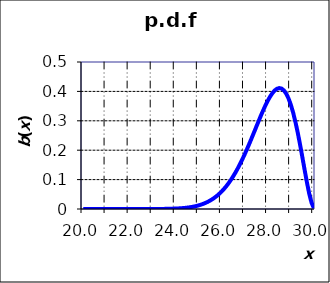
| Category | b(x) |
|---|---|
| 20.0 | 0 |
| 20.1 | 0 |
| 20.200000000000003 | 0 |
| 20.300000000000004 | 0 |
| 20.400000000000006 | 0 |
| 20.500000000000007 | 0 |
| 20.60000000000001 | 0 |
| 20.70000000000001 | 0 |
| 20.80000000000001 | 0 |
| 20.900000000000013 | 0 |
| 21.000000000000014 | 0 |
| 21.100000000000016 | 0 |
| 21.200000000000017 | 0 |
| 21.30000000000002 | 0 |
| 21.40000000000002 | 0 |
| 21.50000000000002 | 0 |
| 21.600000000000023 | 0 |
| 21.700000000000024 | 0 |
| 21.800000000000026 | 0 |
| 21.900000000000027 | 0 |
| 22.00000000000003 | 0 |
| 22.10000000000003 | 0 |
| 22.20000000000003 | 0 |
| 22.300000000000033 | 0 |
| 22.400000000000034 | 0 |
| 22.500000000000036 | 0 |
| 22.600000000000037 | 0 |
| 22.70000000000004 | 0 |
| 22.80000000000004 | 0 |
| 22.90000000000004 | 0 |
| 23.000000000000043 | 0 |
| 23.100000000000044 | 0 |
| 23.200000000000045 | 0 |
| 23.300000000000047 | 0 |
| 23.40000000000005 | 0 |
| 23.50000000000005 | 0 |
| 23.60000000000005 | 0.001 |
| 23.700000000000053 | 0.001 |
| 23.800000000000054 | 0.001 |
| 23.900000000000055 | 0.001 |
| 24.000000000000057 | 0.001 |
| 24.10000000000006 | 0.002 |
| 24.20000000000006 | 0.002 |
| 24.30000000000006 | 0.003 |
| 24.400000000000063 | 0.004 |
| 24.500000000000064 | 0.005 |
| 24.600000000000065 | 0.006 |
| 24.700000000000067 | 0.007 |
| 24.800000000000068 | 0.008 |
| 24.90000000000007 | 0.01 |
| 25.00000000000007 | 0.012 |
| 25.100000000000072 | 0.015 |
| 25.200000000000074 | 0.017 |
| 25.300000000000075 | 0.021 |
| 25.400000000000077 | 0.024 |
| 25.500000000000078 | 0.029 |
| 25.60000000000008 | 0.033 |
| 25.70000000000008 | 0.039 |
| 25.800000000000082 | 0.045 |
| 25.900000000000084 | 0.052 |
| 26.000000000000085 | 0.059 |
| 26.100000000000087 | 0.068 |
| 26.200000000000088 | 0.077 |
| 26.30000000000009 | 0.087 |
| 26.40000000000009 | 0.099 |
| 26.500000000000092 | 0.111 |
| 26.600000000000094 | 0.124 |
| 26.700000000000095 | 0.138 |
| 26.800000000000097 | 0.153 |
| 26.900000000000098 | 0.169 |
| 27.0000000000001 | 0.186 |
| 27.1000000000001 | 0.203 |
| 27.200000000000102 | 0.221 |
| 27.300000000000104 | 0.24 |
| 27.400000000000105 | 0.259 |
| 27.500000000000107 | 0.279 |
| 27.600000000000108 | 0.298 |
| 27.70000000000011 | 0.317 |
| 27.80000000000011 | 0.335 |
| 27.900000000000112 | 0.352 |
| 28.000000000000114 | 0.368 |
| 28.100000000000115 | 0.382 |
| 28.200000000000117 | 0.394 |
| 28.300000000000118 | 0.403 |
| 28.40000000000012 | 0.409 |
| 28.50000000000012 | 0.411 |
| 28.600000000000122 | 0.41 |
| 28.700000000000124 | 0.404 |
| 28.800000000000125 | 0.393 |
| 28.900000000000126 | 0.376 |
| 29.000000000000128 | 0.355 |
| 29.10000000000013 | 0.328 |
| 29.20000000000013 | 0.297 |
| 29.300000000000132 | 0.26 |
| 29.400000000000134 | 0.22 |
| 29.500000000000135 | 0.177 |
| 29.600000000000136 | 0.133 |
| 29.700000000000138 | 0.091 |
| 29.80000000000014 | 0.052 |
| 29.90000000000014 | 0.021 |
| 30.000000000000142 | 0.003 |